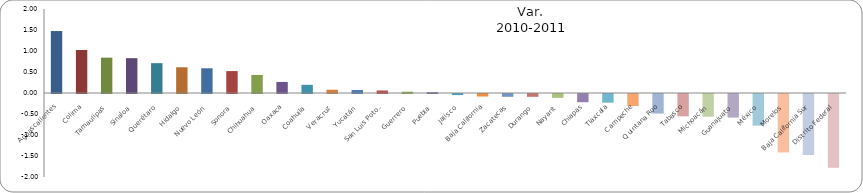
| Category | Var.
 2010-2011 |
|---|---|
| Aguascalientes | 1.475 |
| Colima | 1.024 |
| Tamaulipas | 0.842 |
| Sinaloa | 0.829 |
| Querétaro | 0.71 |
| Hidalgo | 0.612 |
| Nuevo León | 0.588 |
| Sonora | 0.522 |
| Chihuahua | 0.429 |
| Oaxaca | 0.263 |
| Coahuila | 0.195 |
| Veracruz | 0.078 |
| Yucatán | 0.071 |
| San Luis Potosí | 0.06 |
| Guerrero | 0.032 |
| Puebla | 0.019 |
| Jalisco | -0.025 |
| Baja California | -0.06 |
| Zacatecas | -0.067 |
| Durango | -0.067 |
| Nayarit | -0.092 |
| Chiapas | -0.195 |
| Tlaxcala | -0.207 |
| Campeche | -0.287 |
| Quintana Roo | -0.466 |
| Tabasco | -0.532 |
| Michoacán | -0.541 |
| Guanajuato | -0.562 |
| México | -0.753 |
| Morelos | -1.392 |
| Baja California Sur | -1.452 |
| Distrito Federal | -1.758 |